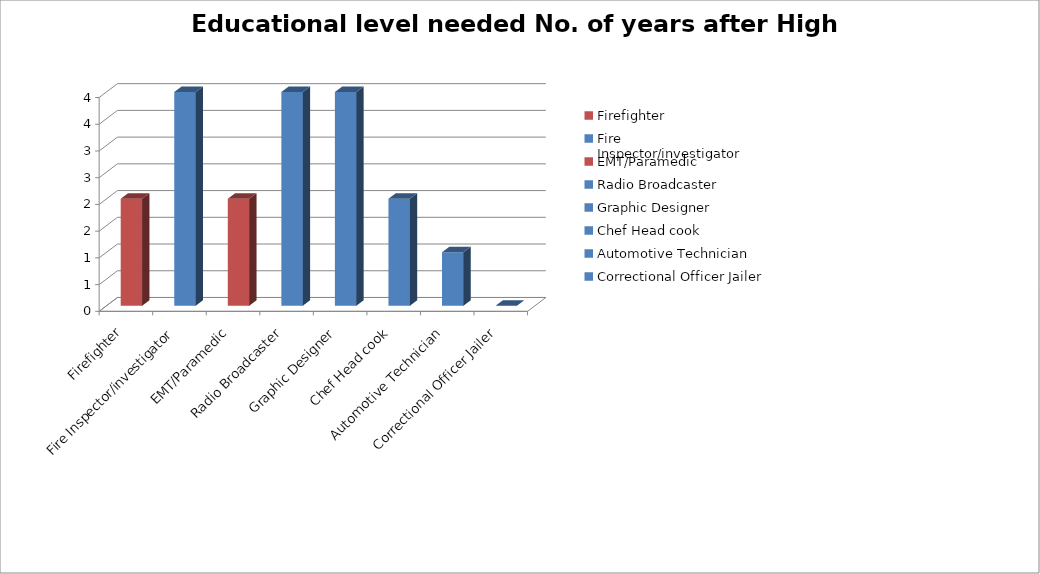
| Category | Educational level needed No. of years after High School |
|---|---|
| Firefighter | 2 |
| Fire Inspector/investigator | 4 |
| EMT/Paramedic | 2 |
| Radio Broadcaster | 4 |
| Graphic Designer  | 4 |
| Chef Head cook | 2 |
| Automotive Technician | 1 |
| Correctional Officer Jailer | 0 |